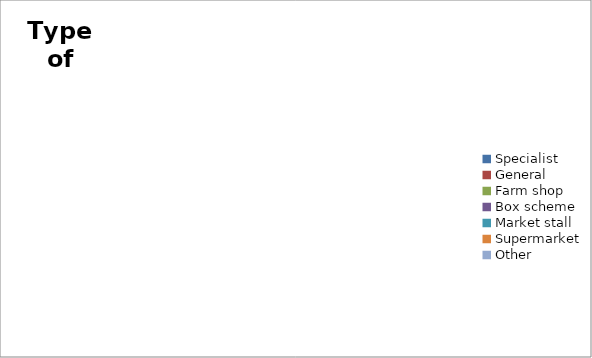
| Category | Series 0 |
|---|---|
| Specialist | 0 |
| General | 0 |
| Farm shop | 0 |
| Box scheme | 0 |
| Market stall | 0 |
| Supermarket | 0 |
| Other | 0 |